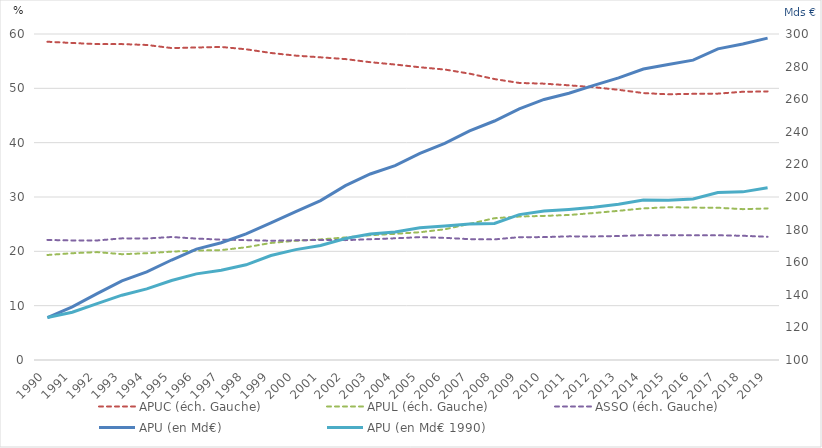
| Category | APUC (éch. Gauche) | APUL (éch. Gauche) | ASSO (éch. Gauche) |
|---|---|---|---|
| 1990.0 | 58.575 | 19.327 | 22.098 |
| 1991.0 | 58.346 | 19.653 | 22.001 |
| 1992.0 | 58.141 | 19.86 | 22 |
| 1993.0 | 58.14 | 19.473 | 22.387 |
| 1994.0 | 57.984 | 19.649 | 22.367 |
| 1995.0 | 57.416 | 19.946 | 22.638 |
| 1996.0 | 57.515 | 20.139 | 22.346 |
| 1997.0 | 57.614 | 20.229 | 22.157 |
| 1998.0 | 57.188 | 20.747 | 22.065 |
| 1999.0 | 56.507 | 21.544 | 21.949 |
| 2000.0 | 56.021 | 21.946 | 22.033 |
| 2001.0 | 55.707 | 22.197 | 22.096 |
| 2002.0 | 55.385 | 22.553 | 22.062 |
| 2003.0 | 54.811 | 22.967 | 22.222 |
| 2004.0 | 54.383 | 23.217 | 22.4 |
| 2005.0 | 53.877 | 23.515 | 22.608 |
| 2006.0 | 53.461 | 24.057 | 22.482 |
| 2007.0 | 52.702 | 25.056 | 22.241 |
| 2008.0 | 51.707 | 26.096 | 22.197 |
| 2009.0 | 50.993 | 26.402 | 22.605 |
| 2010.0 | 50.86 | 26.522 | 22.618 |
| 2011.0 | 50.556 | 26.689 | 22.754 |
| 2012.0 | 50.206 | 27.052 | 22.743 |
| 2013.0 | 49.727 | 27.456 | 22.816 |
| 2014.0 | 49.128 | 27.902 | 22.97 |
| 2015.0 | 48.901 | 28.121 | 22.978 |
| 2016.0 | 48.992 | 28.053 | 22.955 |
| 2017.0 | 49.025 | 28.022 | 22.953 |
| 2018.0 | 49.368 | 27.764 | 22.867 |
| 2019.0 | 49.43 | 27.894 | 22.676 |